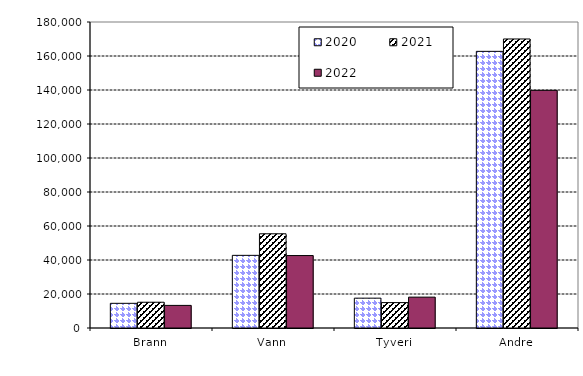
| Category | 2020 | 2021 | 2022 |
|---|---|---|---|
| Brann | 14515.715 | 15152.745 | 13298.618 |
| Vann | 42736.006 | 55420.008 | 42614.573 |
| Tyveri | 17552.031 | 14942.034 | 18156.4 |
| Andre | 162737.467 | 170017.659 | 139810.908 |